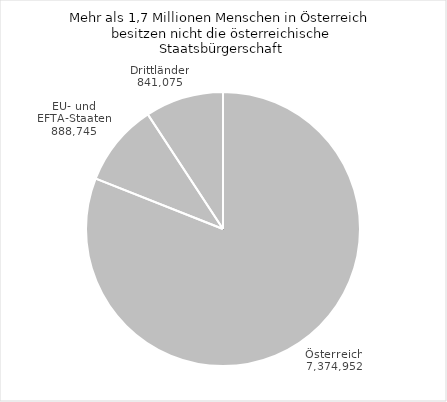
| Category | Bevölkerung nach Staatszugehörigkeit 2023 |
|---|---|
| Österreich | 7374952 |
| EU- und EFTA-Staaten | 888745 |
| Drittländer | 841075 |